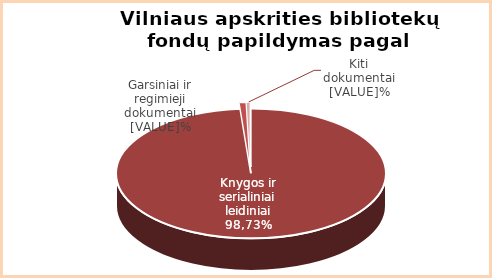
| Category | Series 0 |
|---|---|
| Knygos ir serialiniai | 98.73 |
| Garsiniai ir regimieji | 0.8 |
| Kiti dokumentai | 0.47 |